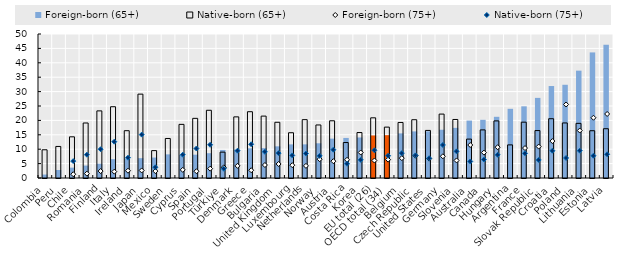
| Category | Foreign-born (65+) | Native-born (65+) |
|---|---|---|
| Colombia | 1.2 | 9.8 |
| Peru | 2.774 | 10.956 |
| Chile | 3.6 | 14.3 |
| Romania | 4.312 | 19.098 |
| Finland | 4.971 | 23.302 |
| Italy | 6.55 | 24.747 |
| Ireland | 6.766 | 16.423 |
| Japan | 6.887 | 29.122 |
| Mexico | 7.1 | 9.51 |
| Sweden | 8.213 | 13.723 |
| Cyprus | 7.998 | 18.625 |
| Spain | 8.095 | 20.71 |
| Portugal | 8.61 | 23.517 |
| Türkiye | 9.738 | 8.981 |
| Denmark | 9.853 | 21.228 |
| Greece | 10.308 | 23.017 |
| Bulgaria | 10.371 | 21.49 |
| United Kingdom | 10.99 | 19.35 |
| Luxembourg | 11.675 | 15.721 |
| Netherlands | 11.681 | 20.261 |
| Norway | 12.054 | 18.419 |
| Austria | 13.67 | 19.869 |
| Costa Rica | 13.911 | 12.312 |
| Korea | 14.071 | 15.786 |
| EU total (26) | 14.773 | 20.898 |
| OECD total (34) | 14.872 | 17.667 |
| Belgium | 15.49 | 19.285 |
| Czech Republic | 16.18 | 20.232 |
| United States | 16.2 | 16.522 |
| Germany | 16.755 | 22.195 |
| Slovenia | 17.411 | 20.319 |
| Australia | 19.941 | 13.508 |
| Canada | 20.205 | 16.701 |
| Hungary | 21.248 | 19.829 |
| Argentina | 24.024 | 11.5 |
| France | 24.892 | 19.39 |
| Slovak Republic | 27.821 | 16.47 |
| Croatia | 31.935 | 20.579 |
| Poland | 32.369 | 19.118 |
| Lithuania | 37.273 | 18.974 |
| Estonia | 43.605 | 16.412 |
| Latvia | 46.246 | 17.117 |